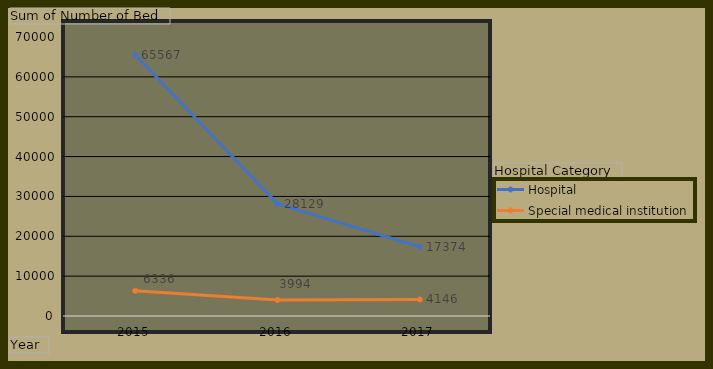
| Category | Hospital | Special medical institution |
|---|---|---|
| 2015 | 65567 | 6336 |
| 2016 | 28129 | 3994 |
| 2017 | 17374 | 4146 |